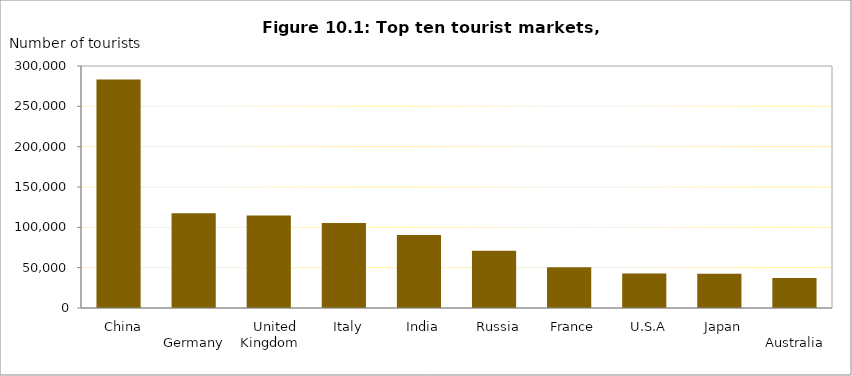
| Category | Series 0 |
|---|---|
|    China | 283116 |
|    Germany | 117532 |
|    United Kingdom | 114602 |
|    Italy | 105297 |
|    India | 90474 |
|    Russia | 70935 |
|    France | 50476 |
|    U.S.A | 42901 |
|    Japan | 42304 |
|    Australia | 37254 |